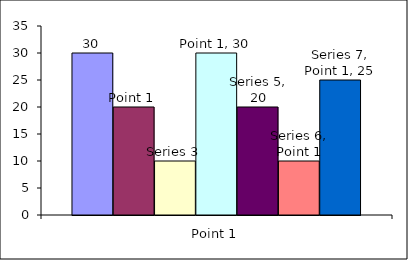
| Category | Series 1 | Series 2 | Series 3 | Series 4 | Series 5 | Series 6 | Series 7 |
|---|---|---|---|---|---|---|---|
| Point 1 | 30 | 20 | 10 | 30 | 20 | 10 | 25 |